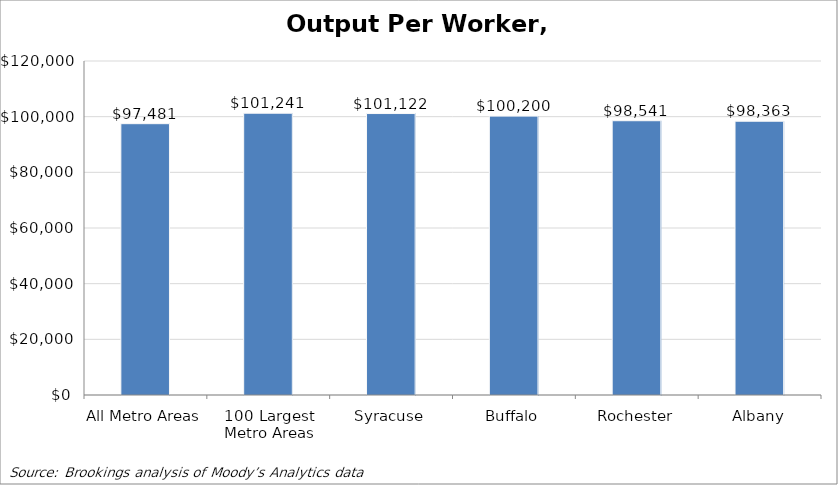
| Category | Output per worker, 2009 |
|---|---|
| All Metro Areas | 97480.617 |
| 100 Largest Metro Areas | 101241.446 |
| Syracuse | 101122.038 |
| Buffalo | 100200.147 |
| Rochester | 98540.785 |
| Albany | 98362.94 |